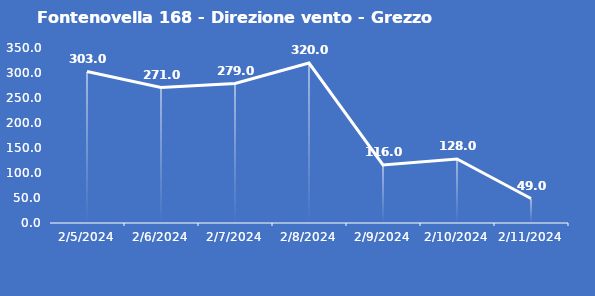
| Category | Fontenovella 168 - Direzione vento - Grezzo (°N) |
|---|---|
| 2/5/24 | 303 |
| 2/6/24 | 271 |
| 2/7/24 | 279 |
| 2/8/24 | 320 |
| 2/9/24 | 116 |
| 2/10/24 | 128 |
| 2/11/24 | 49 |